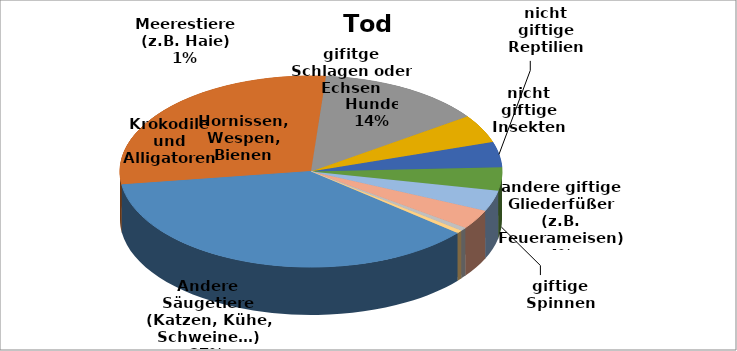
| Category | Series 0 |
|---|---|
| Andere Säugetiere (Katzen, Kühe, Schweine…) | 655 |
| Hornissen, Wespen, Bienen | 509 |
| Hunde | 250 |
| nicht giftige Insekten | 85 |
| nicht giftige Reptilien | 77 |
| giftige Spinnen | 70 |
| andere giftige Gliederfüßer (z.B. Feuerameisen) | 63 |
| gifitge Schlagen oder Echsen | 59 |
| Meerestiere (z.B. Haie) | 10 |
| Krokodile und Alligatoren | 9 |